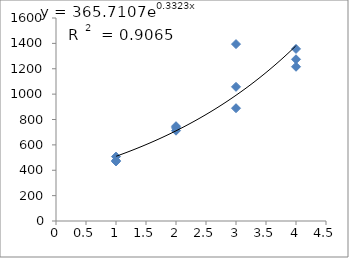
| Category | Series 0 |
|---|---|
| 1.0 | 507.626 |
| 1.0 | 469.315 |
| 1.0 | 476.498 |
| 2.0 | 747.123 |
| 2.0 | 733.86 |
| 2.0 | 711.756 |
| 3.0 | 1057.416 |
| 3.0 | 888.978 |
| 3.0 | 1394.292 |
| 4.0 | 1215.757 |
| 4.0 | 1356.386 |
| 4.0 | 1274.73 |